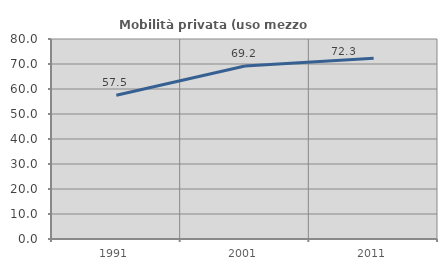
| Category | Mobilità privata (uso mezzo privato) |
|---|---|
| 1991.0 | 57.503 |
| 2001.0 | 69.221 |
| 2011.0 | 72.278 |